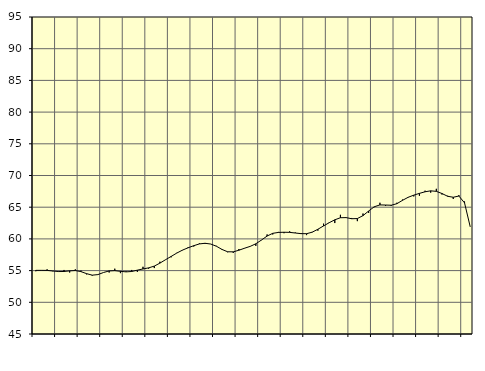
| Category | Piggar | Samtliga sysselsatta (inkl. sysselsatta utomlands) |
|---|---|---|
| nan | 54.9 | 55.04 |
| 1.0 | 55 | 55.04 |
| 1.0 | 55.2 | 55.03 |
| 1.0 | 54.9 | 54.94 |
| nan | 54.8 | 54.85 |
| 2.0 | 55.1 | 54.86 |
| 2.0 | 54.7 | 54.96 |
| 2.0 | 55.2 | 55.01 |
| nan | 55 | 54.84 |
| 3.0 | 54.4 | 54.52 |
| 3.0 | 54.2 | 54.28 |
| 3.0 | 54.4 | 54.37 |
| nan | 54.7 | 54.7 |
| 4.0 | 54.7 | 54.95 |
| 4.0 | 55.3 | 54.99 |
| 4.0 | 54.6 | 54.89 |
| nan | 54.9 | 54.8 |
| 5.0 | 55.1 | 54.86 |
| 5.0 | 54.8 | 55.07 |
| 5.0 | 55.6 | 55.26 |
| nan | 55.3 | 55.43 |
| 6.0 | 55.4 | 55.71 |
| 6.0 | 56.4 | 56.18 |
| 6.0 | 56.7 | 56.72 |
| nan | 57.1 | 57.24 |
| 7.0 | 57.8 | 57.77 |
| 7.0 | 58.2 | 58.23 |
| 7.0 | 58.7 | 58.6 |
| nan | 58.8 | 58.93 |
| 8.0 | 59.3 | 59.21 |
| 8.0 | 59.2 | 59.31 |
| 8.0 | 59.2 | 59.19 |
| nan | 58.9 | 58.85 |
| 9.0 | 58.4 | 58.34 |
| 9.0 | 57.9 | 57.97 |
| 9.0 | 57.8 | 57.96 |
| nan | 58.4 | 58.21 |
| 10.0 | 58.5 | 58.53 |
| 10.0 | 58.8 | 58.82 |
| 10.0 | 58.9 | 59.23 |
| nan | 59.8 | 59.82 |
| 11.0 | 60.7 | 60.45 |
| 11.0 | 60.7 | 60.88 |
| 11.0 | 61.1 | 61.02 |
| nan | 60.9 | 61.05 |
| 12.0 | 61.2 | 61.03 |
| 12.0 | 61 | 60.93 |
| 12.0 | 60.9 | 60.83 |
| nan | 60.6 | 60.82 |
| 13.0 | 61.1 | 61.06 |
| 13.0 | 61.3 | 61.52 |
| 13.0 | 62.4 | 62.04 |
| nan | 62.6 | 62.55 |
| 14.0 | 62.5 | 63.01 |
| 14.0 | 63.8 | 63.34 |
| 14.0 | 63.4 | 63.36 |
| nan | 63.3 | 63.18 |
| 15.0 | 62.8 | 63.21 |
| 15.0 | 64 | 63.67 |
| 15.0 | 64.1 | 64.4 |
| nan | 65 | 65.07 |
| 16.0 | 65.7 | 65.36 |
| 16.0 | 65.2 | 65.34 |
| 16.0 | 65.2 | 65.31 |
| nan | 65.7 | 65.55 |
| 17.0 | 66.2 | 66.08 |
| 17.0 | 66.6 | 66.56 |
| 17.0 | 66.7 | 66.9 |
| nan | 66.8 | 67.18 |
| 18.0 | 67.6 | 67.43 |
| 18.0 | 67.3 | 67.58 |
| 18.0 | 67.9 | 67.5 |
| nan | 67 | 67.16 |
| 19.0 | 66.8 | 66.72 |
| 19.0 | 66.3 | 66.57 |
| 19.0 | 66.9 | 66.76 |
| nan | 65.9 | 65.68 |
| 20.0 | 61.9 | 61.94 |